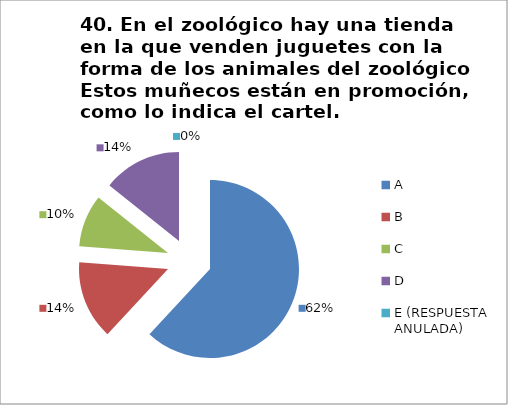
| Category | CANTIDAD DE RESPUESTAS PREGUNTA (40) | PORCENTAJE |
|---|---|---|
| A | 13 | 0.619 |
| B | 3 | 0.143 |
| C | 2 | 0.095 |
| D | 3 | 0.143 |
| E (RESPUESTA ANULADA) | 0 | 0 |